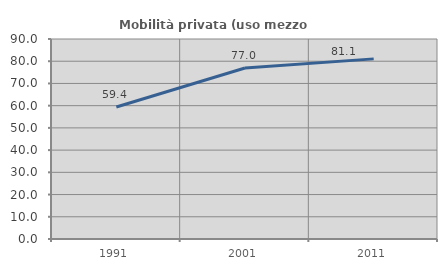
| Category | Mobilità privata (uso mezzo privato) |
|---|---|
| 1991.0 | 59.416 |
| 2001.0 | 76.954 |
| 2011.0 | 81.057 |